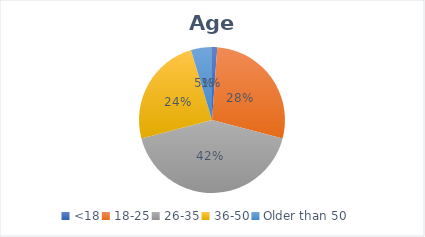
| Category | Series 0 |
|---|---|
| <18 | 1 |
| 18-25 | 24 |
| 26-35 | 36 |
| 36-50 | 21 |
| Older than 50 | 4 |